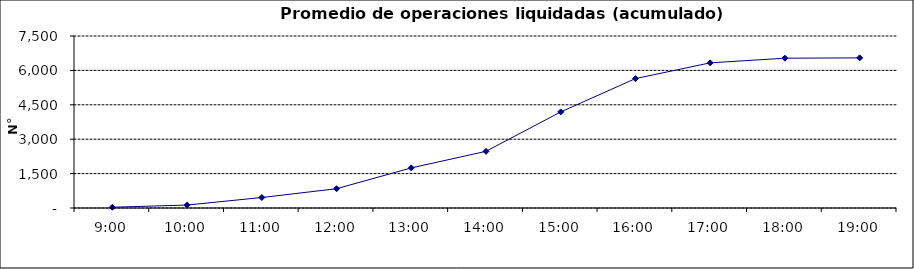
| Category | Promedio Op.Liquidadas (acumulado) |
|---|---|
| 0.375 | 33.591 |
| 0.4166666666666667 | 128.909 |
| 0.4583333333333333 | 457.818 |
| 0.5 | 840.364 |
| 0.5416666666666666 | 1747.727 |
| 0.5833333333333334 | 2471.727 |
| 0.625 | 4189.182 |
| 0.6666666666666666 | 5642.182 |
| 0.7083333333333334 | 6329.318 |
| 0.75 | 6532.409 |
| 0.7916666666666666 | 6545.727 |